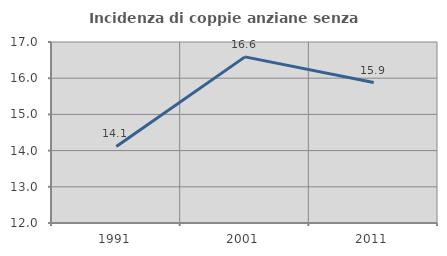
| Category | Incidenza di coppie anziane senza figli  |
|---|---|
| 1991.0 | 14.116 |
| 2001.0 | 16.589 |
| 2011.0 | 15.88 |